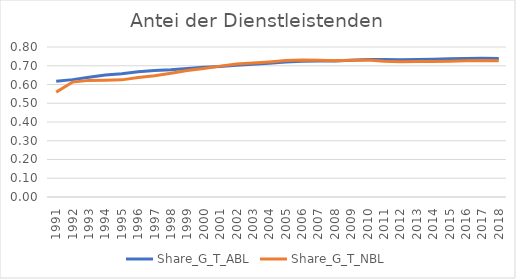
| Category | Share_G_T_ABL | Share_G_T_NBL |
|---|---|---|
| 1991.0 | 0.618 | 0.559 |
| 1992.0 | 0.626 | 0.613 |
| 1993.0 | 0.639 | 0.622 |
| 1994.0 | 0.65 | 0.623 |
| 1995.0 | 0.658 | 0.625 |
| 1996.0 | 0.667 | 0.637 |
| 1997.0 | 0.675 | 0.647 |
| 1998.0 | 0.679 | 0.661 |
| 1999.0 | 0.686 | 0.674 |
| 2000.0 | 0.692 | 0.686 |
| 2001.0 | 0.696 | 0.698 |
| 2002.0 | 0.702 | 0.709 |
| 2003.0 | 0.708 | 0.715 |
| 2004.0 | 0.714 | 0.721 |
| 2005.0 | 0.72 | 0.727 |
| 2006.0 | 0.724 | 0.731 |
| 2007.0 | 0.725 | 0.729 |
| 2008.0 | 0.725 | 0.727 |
| 2009.0 | 0.73 | 0.729 |
| 2010.0 | 0.734 | 0.73 |
| 2011.0 | 0.733 | 0.724 |
| 2012.0 | 0.732 | 0.722 |
| 2013.0 | 0.734 | 0.723 |
| 2014.0 | 0.734 | 0.722 |
| 2015.0 | 0.737 | 0.724 |
| 2016.0 | 0.739 | 0.727 |
| 2017.0 | 0.74 | 0.728 |
| 2018.0 | 0.739 | 0.727 |